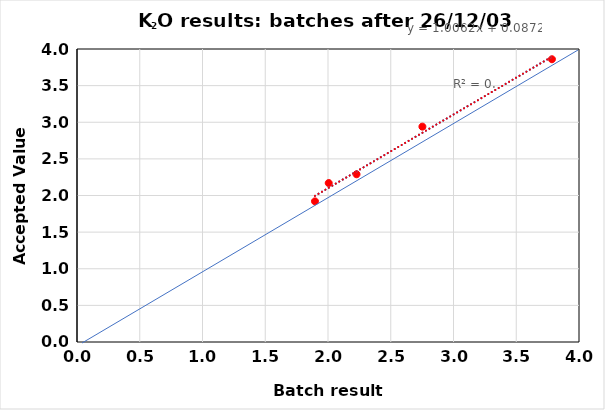
| Category | y |
|---|---|
| 2.0055555555555555 | 2.17 |
| 2.2273333333333336 | 2.29 |
| 2.7521428571428577 | 2.94 |
| 3.7842857142857147 | 3.86 |
| 1.89625 | 1.92 |